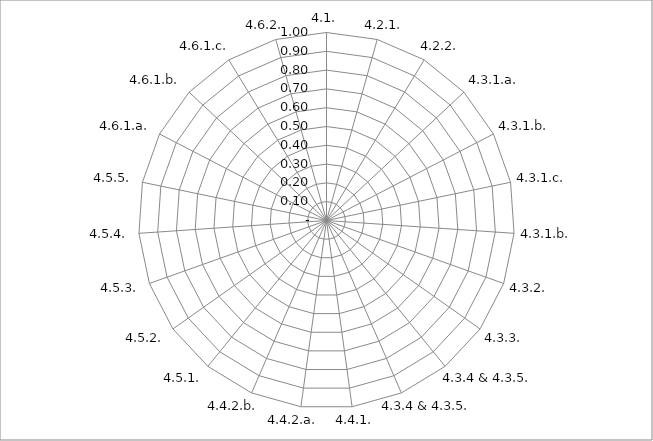
| Category | Series 0 |
|---|---|
| 4.1. | 0 |
| 4.2.1. | 0 |
| 4.2.2. | 0 |
| 4.3.1.a. | 0 |
| 4.3.1.b. | 0 |
| 4.3.1.c. | 0 |
| 4.3.1.b. | 0 |
| 4.3.2. | 0 |
| 4.3.3. | 0 |
| 4.3.4 & 4.3.5. | 0 |
| 4.3.4 & 4.3.5. | 0 |
| 4.4.1. | 0 |
| 4.4.2.a. | 0 |
| 4.4.2.b. | 0 |
| 4.5.1. | 0 |
| 4.5.2. | 0 |
| 4.5.3. | 0 |
| 4.5.4. | 0 |
| 4.5.5. | 0 |
| 4.6.1.a. | 0 |
| 4.6.1.b. | 0 |
| 4.6.1.c. | 0 |
| 4.6.2. | 0 |